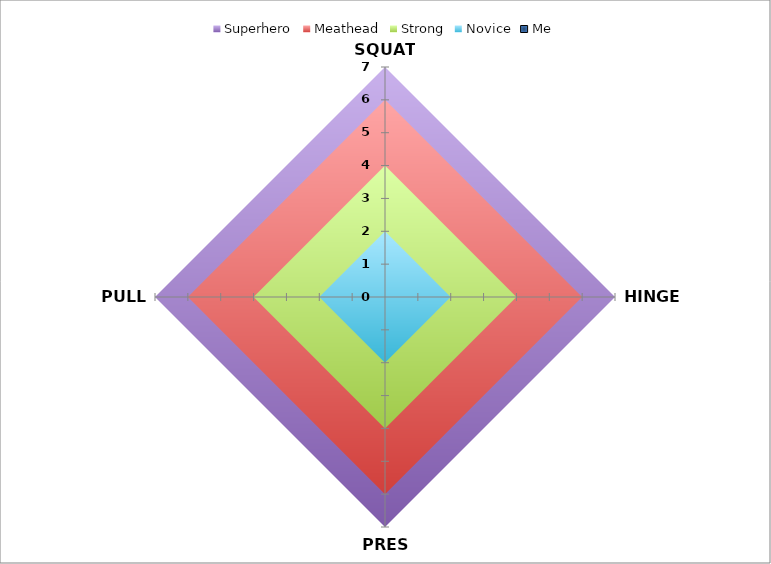
| Category | Superhero | Meathead | Strong | Novice | Me |
|---|---|---|---|---|---|
| SQUAT | 7 | 6 | 4 | 2 | 0 |
| HINGE | 7 | 6 | 4 | 2 | 0 |
| PRESS | 7 | 6 | 4 | 2 | 0 |
| PULL | 7 | 6 | 4 | 2 | 0 |